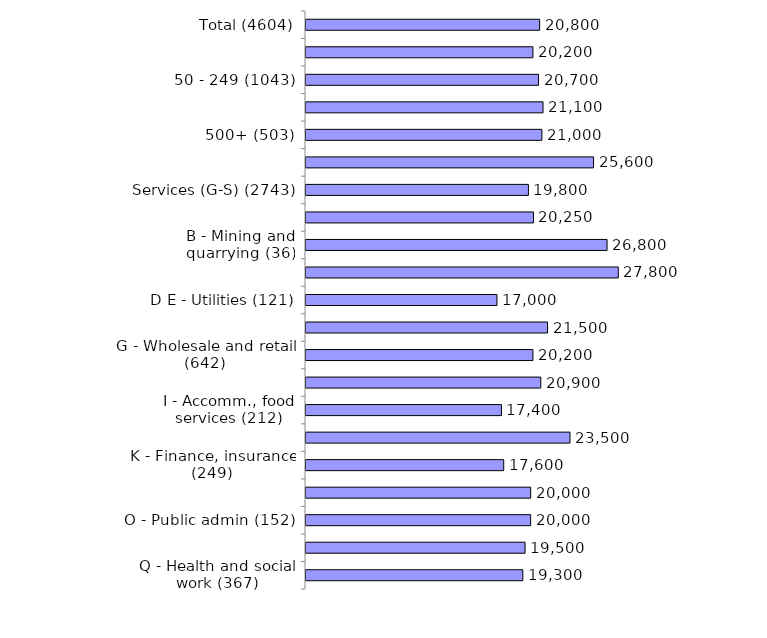
| Category | Series 0 |
|---|---|
| Total (4604) | 20800 |
| 10-49 (2678) | 20200 |
| 50 - 249 (1043) | 20700 |
| 250 - 499 (380) | 21100 |
| 500+ (503) | 21000 |
| Production (A-F) (1861) | 25600 |
| Services (G-S) (2743) | 19800 |
| A - Agriculture (135) | 20250 |
| B - Mining and quarrying (36) | 26800 |
| C - Manufacturing (1396) | 27800 |
| D E - Utilities (121) | 17000 |
| F - Construction (173) | 21500 |
| G - Wholesale and retail (642) | 20200 |
| H - Transport, storage (203) | 20900 |
| I - Accomm., food services (212) | 17400 |
| J - Information, comms (170) | 23500 |
| K - Finance, insurance (249) | 17600 |
| LMNRS - Bus/tech/admin/arts/other (366) | 20000 |
| O - Public admin (152) | 20000 |
| P - Education (382) | 19500 |
| Q - Health and social work (367) | 19300 |